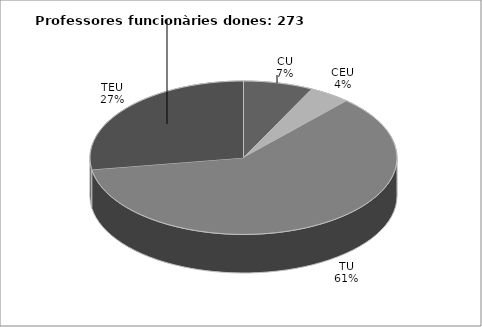
| Category | DONES |
|---|---|
| CU | 20 |
| CEU | 12 |
| TU | 166 |
| TEU | 75 |